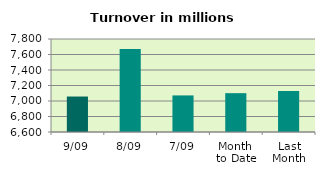
| Category | Series 0 |
|---|---|
| 9/09 | 7057.731 |
| 8/09 | 7672.509 |
| 7/09 | 7072.029 |
| Month 
to Date | 7101.118 |
| Last
Month | 7128.729 |